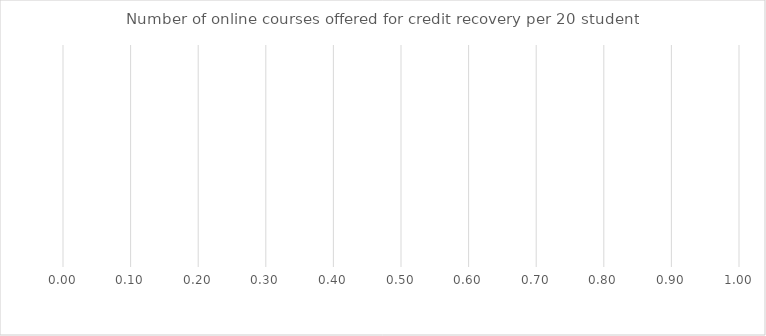
| Category | Benchmark | Title IV-A Identified Schools | Entire LEA  |
|---|---|---|---|
| Number of online courses offered for credit recovery per 20 students | 0 | 0 | 0 |